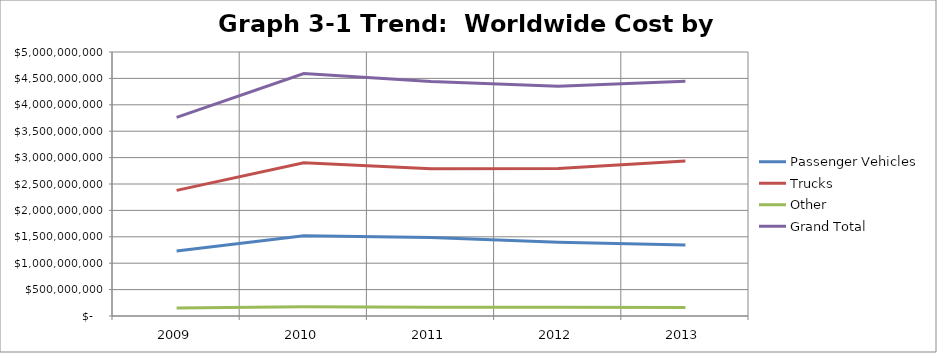
| Category | Passenger Vehicles | Trucks | Other | Grand Total |
|---|---|---|---|---|
| 2009.0 | 1229151249.24 | 2379688708.89 | 152116744.18 | 3760956702.32 |
| 2010.0 | 1518218069.51 | 2901799791.47 | 173256522.87 | 4593274383.86 |
| 2011.0 | 1489003478.4 | 2788393970.39 | 163977575.11 | 4441375023.9 |
| 2012.0 | 1396864418.5 | 2791305130.67 | 165229139.74 | 4353398688.92 |
| 2013.0 | 1345843523.46 | 2934630164.62 | 163339848.97 | 4443813537.06 |